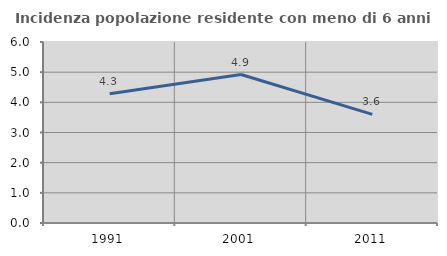
| Category | Incidenza popolazione residente con meno di 6 anni |
|---|---|
| 1991.0 | 4.286 |
| 2001.0 | 4.922 |
| 2011.0 | 3.6 |